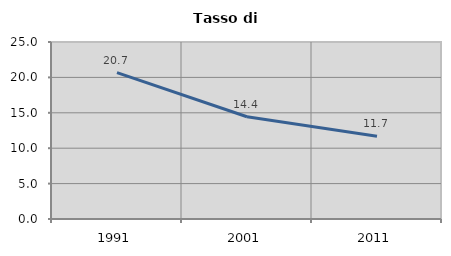
| Category | Tasso di disoccupazione   |
|---|---|
| 1991.0 | 20.679 |
| 2001.0 | 14.447 |
| 2011.0 | 11.694 |